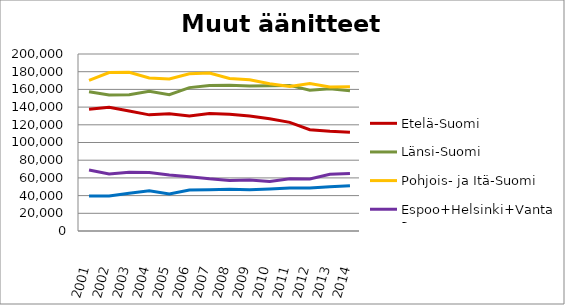
| Category | Etelä-Suomi | Länsi-Suomi | Pohjois- ja Itä-Suomi | Espoo+Helsinki+Vantaa | Muu Uusimaa |
|---|---|---|---|---|---|
| 2001.0 | 137514 | 157330 | 170218 | 68940 | 39458 |
| 2002.0 | 139845 | 153694 | 178983 | 64539 | 39581 |
| 2003.0 | 135674 | 153845 | 179400 | 66415 | 42552 |
| 2004.0 | 131233 | 157754 | 172979 | 66226 | 45375 |
| 2005.0 | 132403 | 154051 | 171817 | 63380 | 41740 |
| 2006.0 | 130091 | 162031 | 177623 | 61379 | 46351 |
| 2007.0 | 132804 | 164429 | 178479 | 58982 | 46736 |
| 2008.0 | 131932 | 164631 | 172377 | 57188 | 47242 |
| 2009.0 | 129943 | 163896 | 170811 | 57755 | 46642 |
| 2010.0 | 126947 | 164111 | 166488 | 55854 | 47510 |
| 2011.0 | 122759 | 164504 | 163340 | 58931 | 48474 |
| 2012.0 | 114451 | 158962 | 166656 | 58832 | 48639 |
| 2013.0 | 112617 | 160612 | 162824 | 63992 | 50134 |
| 2014.0 | 111693 | 158495 | 163087 | 64903 | 51102 |